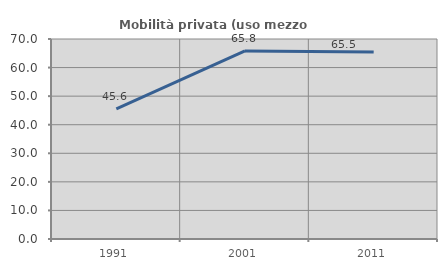
| Category | Mobilità privata (uso mezzo privato) |
|---|---|
| 1991.0 | 45.57 |
| 2001.0 | 65.842 |
| 2011.0 | 65.487 |